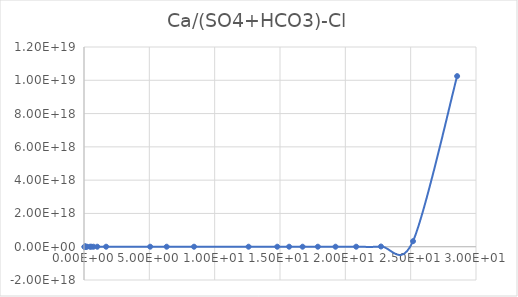
| Category | Series 0 |
|---|---|
| 0.045802 | 2.095 |
| 0.050891 | 2.108 |
| 0.057266 | 2.124 |
| 0.065465 | 2.143 |
| 0.076382 | 2.168 |
| 0.091701 | 2.2 |
| 0.11466 | 2.248 |
| 0.15303 | 2.325 |
| 0.22981 | 2.482 |
| 0.46205 | 3.06 |
| 0.56468 | 3.385 |
| 0.72591 | 4.012 |
| 1.016 | 5.671 |
| 1.6924 | 15.185 |
| 5.0651 | 7350.004 |
| 6.3257 | 75401.538 |
| 8.4218 | 3037306.541 |
| 12.594 | 881432321.058 |
| 14.79 | 25053470489.127 |
| 15.7 | 112903751153.308 |
| 16.727 | 629314756894.799 |
| 17.897 | 4470554926387.014 |
| 19.248 | 43059710321282.78 |
| 20.83 | 603771102828326.9 |
| 22.728 | 12641364932136322 |
| 25.18 | 332718267456540736 |
| 28.556 | 10251136686558681088 |